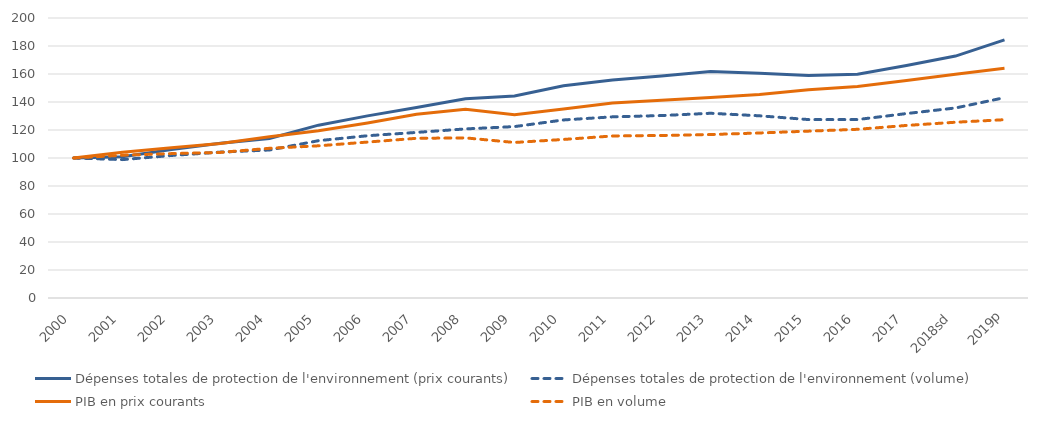
| Category | Dépenses totales de protection de l'environnement (prix courants) | Dépenses totales de protection de l'environnement (volume) | PIB en prix courants | PIB en volume |
|---|---|---|---|---|
| 2000 | 100 | 100 | 100 | 100 |
| 2001 | 100.819 | 98.834 | 104.032 | 101.984 |
| 2002 | 106.001 | 101.809 | 107.388 | 103.142 |
| 2003 | 110.521 | 104.213 | 110.286 | 103.991 |
| 2004 | 113.932 | 105.713 | 115.247 | 106.933 |
| 2005 | 123.447 | 112.367 | 119.432 | 108.712 |
| 2006 | 130.079 | 115.905 | 124.995 | 111.375 |
| 2007 | 136.136 | 118.278 | 131.299 | 114.075 |
| 2008 | 142.301 | 120.776 | 134.749 | 114.366 |
| 2009 | 144.355 | 122.437 | 130.965 | 111.08 |
| 2010 | 151.552 | 127.181 | 134.946 | 113.245 |
| 2011 | 155.651 | 129.395 | 139.212 | 115.729 |
| 2012 | 158.575 | 130.311 | 141.27 | 116.091 |
| 2013 | 161.811 | 131.944 | 143.19 | 116.76 |
| 2014 | 160.524 | 130.143 | 145.393 | 117.876 |
| 2015 | 158.99 | 127.449 | 148.685 | 119.188 |
| 2016 | 159.836 | 127.461 | 151.099 | 120.494 |
| 2017 | 166.068 | 131.744 | 155.368 | 123.255 |
| 2018sd | 172.801 | 135.739 | 159.836 | 125.554 |
| 2019p | 184.341 | 143.105 | 164.056 | 127.358 |